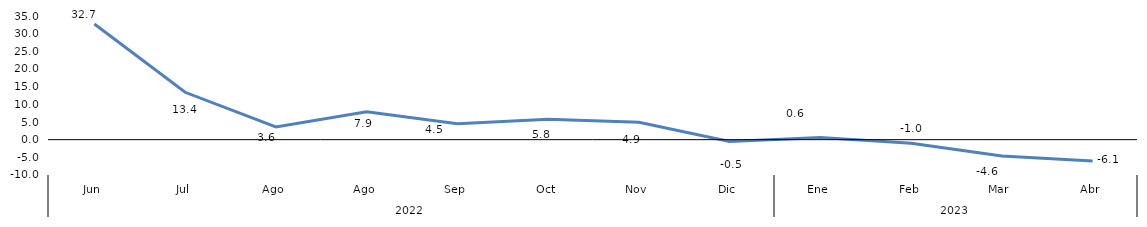
| Category | Bogotá |
|---|---|
| 0 | 32.728 |
| 1 | 13.412 |
| 2 | 3.61 |
| 3 | 7.889 |
| 4 | 4.529 |
| 5 | 5.753 |
| 6 | 4.926 |
| 7 | -0.485 |
| 8 | 0.585 |
| 9 | -1 |
| 10 | -4.637 |
| 11 | -6.05 |